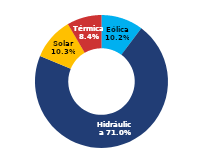
| Category | Sur |
|---|---|
| Eólica | 62.937 |
| Hidráulica | 437.681 |
| Solar | 63.608 |
| Térmica | 51.923 |